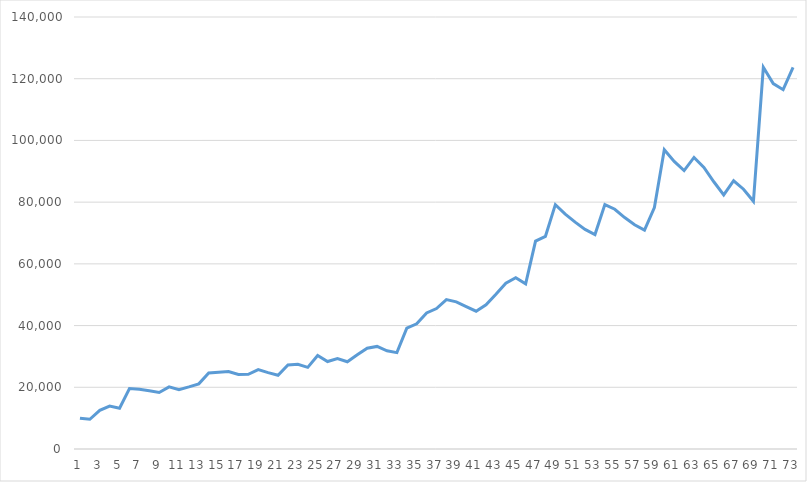
| Category | Amount |
|---|---|
| 0 | 10000 |
| 1 | 9624 |
| 2 | 12532.5 |
| 3 | 13923.9 |
| 4 | 13228.05 |
| 5 | 19572.85 |
| 6 | 19337.65 |
| 7 | 18855.4 |
| 8 | 18324.9 |
| 9 | 20148.9 |
| 10 | 19228.2 |
| 11 | 20114.2 |
| 12 | 21112.6 |
| 13 | 24647.8 |
| 14 | 24885.1 |
| 15 | 25101.1 |
| 16 | 24141.1 |
| 17 | 24191.5 |
| 18 | 25721.1 |
| 19 | 24765.9 |
| 20 | 23887.7 |
| 21 | 27252.5 |
| 22 | 27448.9 |
| 23 | 26461.3 |
| 24 | 30319.7 |
| 25 | 28355.7 |
| 26 | 29325.3 |
| 27 | 28273.2 |
| 28 | 30511.6 |
| 29 | 32671.6 |
| 30 | 33240.7 |
| 31 | 31832.65 |
| 32 | 31239.25 |
| 33 | 39188.05 |
| 34 | 40587.1 |
| 35 | 44102.3 |
| 36 | 45519.3 |
| 37 | 48436.1 |
| 38 | 47702.3 |
| 39 | 46147.1 |
| 40 | 44651.9 |
| 41 | 46754.3 |
| 42 | 50162.3 |
| 43 | 53735.3 |
| 44 | 55521.3 |
| 45 | 53536.8 |
| 46 | 67364.8 |
| 47 | 68924.8 |
| 48 | 79181.2 |
| 49 | 76120.45 |
| 50 | 73515.05 |
| 51 | 71149.05 |
| 52 | 69509.65 |
| 53 | 79207.45 |
| 54 | 77698.25 |
| 55 | 75014.45 |
| 56 | 72677.85 |
| 57 | 70955.85 |
| 58 | 78222.55 |
| 59 | 96989.55 |
| 60 | 93180.75 |
| 61 | 90243.15 |
| 62 | 94484.85 |
| 63 | 91259.25 |
| 64 | 86608.05 |
| 65 | 82355.25 |
| 66 | 86937.65 |
| 67 | 84193.65 |
| 68 | 80276.85 |
| 69 | 123699.25 |
| 70 | 118419.25 |
| 71 | 116447.25 |
| 72 | 123674.25 |